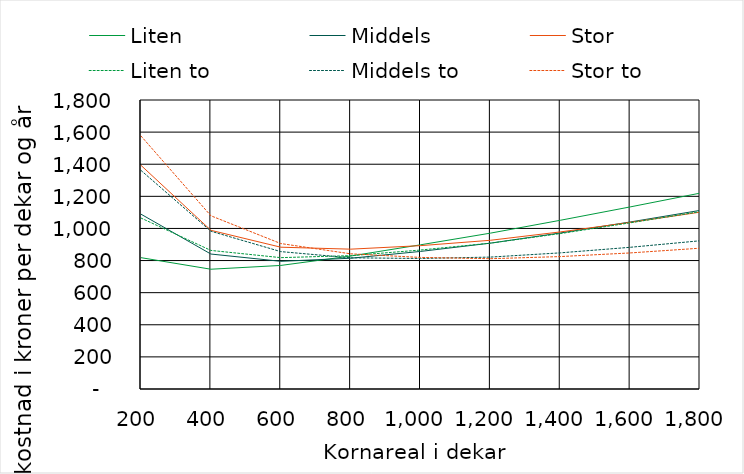
| Category | Liten | Middels | Stor | Liten to | Middels to | Stor to |
|---|---|---|---|---|---|---|
| 200.0 | 818.036 | 1088.854 | 1392.976 | 1064.847 | 1361.387 | 1575.864 |
| 400.0 | 745.968 | 840.553 | 988.439 | 863.147 | 982.745 | 1078.924 |
| 600.0 | 769.558 | 795.352 | 883.166 | 818.127 | 855.709 | 905.978 |
| 800.0 | 828.179 | 814.39 | 870.947 | 830.473 | 817.037 | 841.942 |
| 1000.0 | 898.082 | 856.869 | 892.83 | 865.5 | 813.047 | 819.542 |
| 1200.0 | 970.682 | 908.344 | 926.182 | 908.434 | 821.543 | 811.509 |
| 1400.0 | 1050.794 | 971.763 | 978.285 | 968.003 | 847.944 | 824.761 |
| 1600.0 | 1134.038 | 1040.174 | 1037.412 | 1034.894 | 882.537 | 847.451 |
| 1800.0 | 1219.825 | 1112.386 | 1101.444 | 1104.674 | 923.16 | 877.008 |